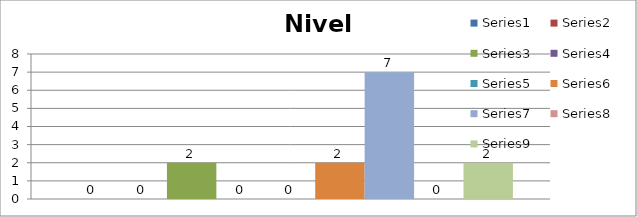
| Category | Series 0 | Series 1 | Series 2 | Series 3 | Series 4 | Series 5 | Series 6 | Series 7 | Series 8 |
|---|---|---|---|---|---|---|---|---|---|
| 0 | 0 | 0 | 2 | 0 | 0 | 2 | 7 | 0 | 2 |